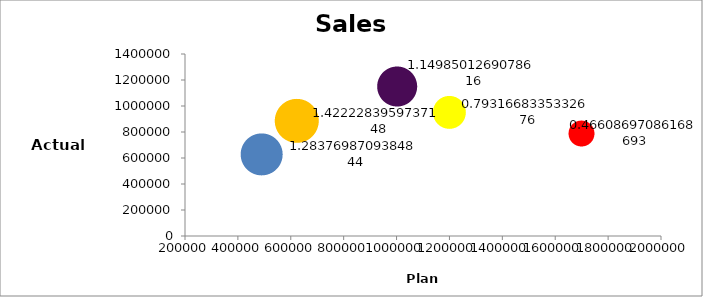
| Category | Series 0 |
|---|---|
| 1199561.0 | 951452 |
| 1001514.0 | 1151591 |
| 622708.0 | 885633 |
| 489534.0 | 628449 |
| 1697902.0 | 791370 |